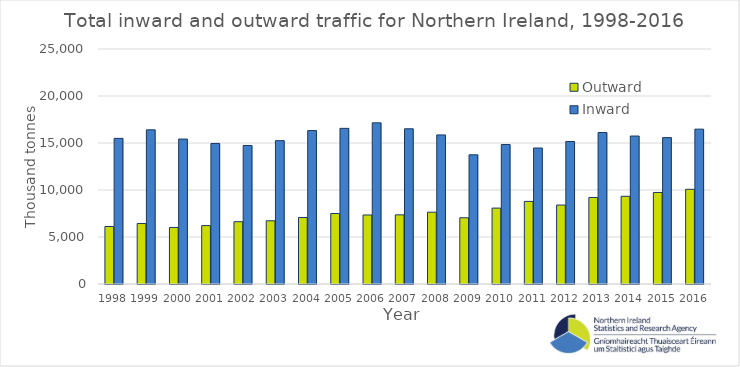
| Category | Outward | Inward |
|---|---|---|
| 1998.0 | 6118 | 15493 |
| 1999.0 | 6432 | 16399 |
| 2000.0 | 6017 | 15418 |
| 2001.0 | 6212 | 14955 |
| 2002.0 | 6627 | 14736 |
| 2003.0 | 6724 | 15250 |
| 2004.0 | 7070 | 16322 |
| 2005.0 | 7497 | 16558 |
| 2006.0 | 7342 | 17143 |
| 2007.0 | 7356 | 16512 |
| 2008.0 | 7638 | 15860 |
| 2009.0 | 7043 | 13743 |
| 2010.0 | 8074 | 14837 |
| 2011.0 | 8787 | 14465 |
| 2012.0 | 8398 | 15158 |
| 2013.0 | 9207 | 16115 |
| 2014.0 | 9331 | 15742 |
| 2015.0 | 9739 | 15573 |
| 2016.0 | 10076 | 16474 |